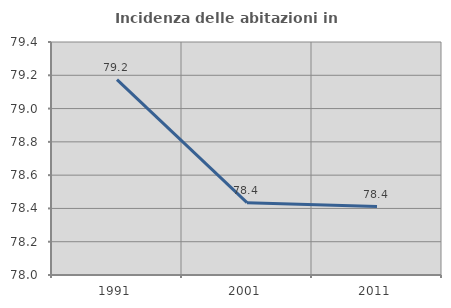
| Category | Incidenza delle abitazioni in proprietà  |
|---|---|
| 1991.0 | 79.174 |
| 2001.0 | 78.435 |
| 2011.0 | 78.411 |